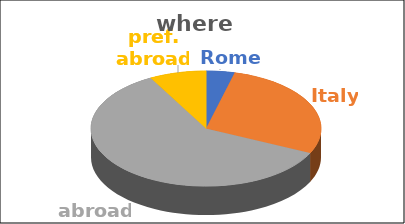
| Category | where | Series 1 | Series 2 | Series 3 | Series 4 |
|---|---|---|---|---|---|
| Rome | 0.04 |  |  |  |  |
| Italy | 0.28 |  |  |  |  |
| abroad | 0.6 |  |  |  |  |
| pref. abroad | 0.08 |  |  |  |  |